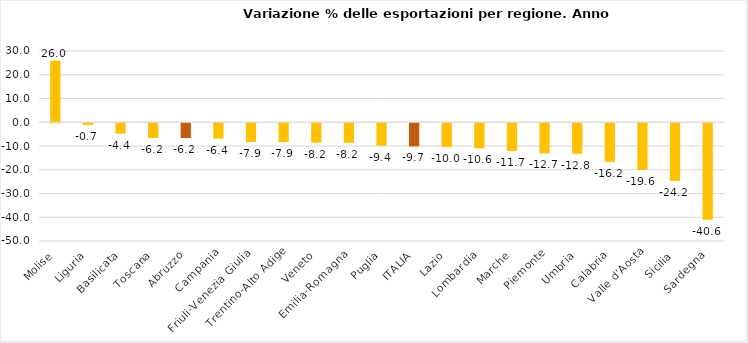
| Category | Series 0 |
|---|---|
| Molise | 25.987 |
| Liguria | -0.73 |
| Basilicata | -4.384 |
| Toscana | -6.176 |
| Abruzzo | -6.215 |
| Campania | -6.427 |
| Friuli-Venezia Giulia | -7.924 |
| Trentino-Alto Adige | -7.945 |
| Veneto | -8.182 |
| Emilia-Romagna | -8.215 |
| Puglia | -9.423 |
| ITALIA | -9.741 |
| Lazio | -10.026 |
| Lombardia | -10.563 |
| Marche | -11.658 |
| Piemonte | -12.691 |
| Umbria | -12.82 |
| Calabria | -16.248 |
| Valle d'Aosta | -19.65 |
| Sicilia | -24.249 |
| Sardegna | -40.635 |